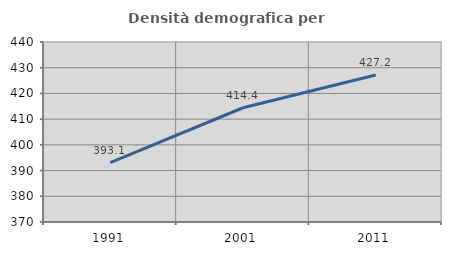
| Category | Densità demografica |
|---|---|
| 1991.0 | 393.129 |
| 2001.0 | 414.434 |
| 2011.0 | 427.159 |